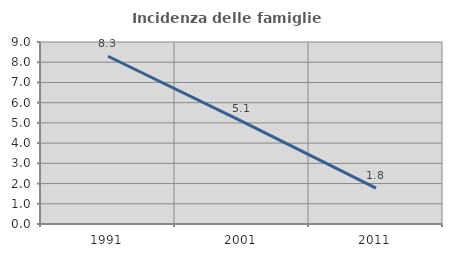
| Category | Incidenza delle famiglie numerose |
|---|---|
| 1991.0 | 8.295 |
| 2001.0 | 5.075 |
| 2011.0 | 1.771 |